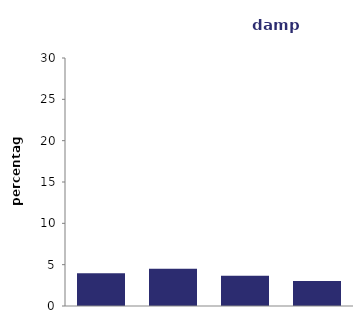
| Category | damp |
|---|---|
| house | 3.957 |
| three 
or less | 4.498 |
| four to 
five  | 3.65 |
| high rise | 3.023 |